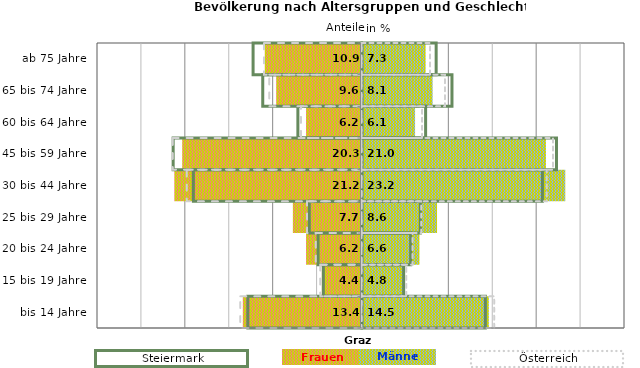
| Category | Frauen | Männer | Frauen Spalte2 | Männer Spalte2 | Frauen Spalte3 | Männer Spalte3 |
|---|---|---|---|---|---|---|
| bis 14 Jahre | -13.4 | 14.5 | 14.1 | -13 | -13.8 | 15.1 |
| 15 bis 19 Jahre | -4.4 | 4.8 | 4.8 | -4.4 | -4.7 | 5.1 |
| 20 bis 24 Jahre | -6.2 | 6.6 | 5.6 | -5 | -5.2 | 5.8 |
| 25 bis 29 Jahre | -7.7 | 8.6 | 6.7 | -6 | -6.2 | 6.8 |
| 30 bis 44 Jahre | -21.2 | 23.2 | 20.6 | -19.2 | -19.9 | 21.1 |
| 45 bis 59 Jahre | -20.3 | 21 | 22.2 | -21.5 | -21.5 | 21.8 |
| 60 bis 64 Jahre | -6.2 | 6.1 | 7.3 | -7.3 | -6.9 | 6.9 |
| 65 bis 74 Jahre | -9.6 | 8.1 | 10.3 | -11.3 | -10.5 | 9.5 |
| ab 75 Jahre | -10.9 | 7.3 | 8.5 | -12.4 | -11.1 | 7.8 |